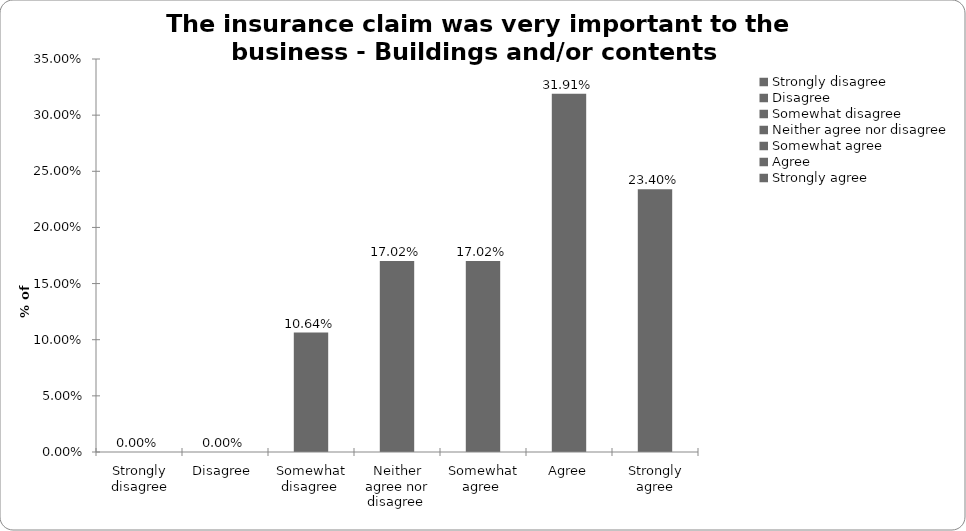
| Category | Buildings and/or conents |
|---|---|
| Strongly disagree | 0 |
| Disagree  | 0 |
| Somewhat disagree  | 0.106 |
| Neither agree nor disagree  | 0.17 |
| Somewhat agree  | 0.17 |
| Agree | 0.319 |
| Strongly agree | 0.234 |